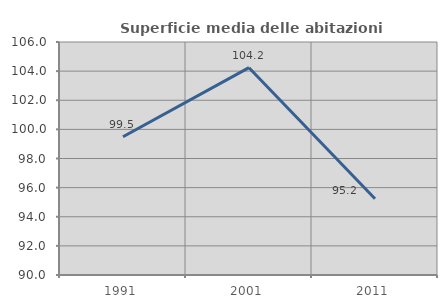
| Category | Superficie media delle abitazioni occupate |
|---|---|
| 1991.0 | 99.491 |
| 2001.0 | 104.237 |
| 2011.0 | 95.231 |